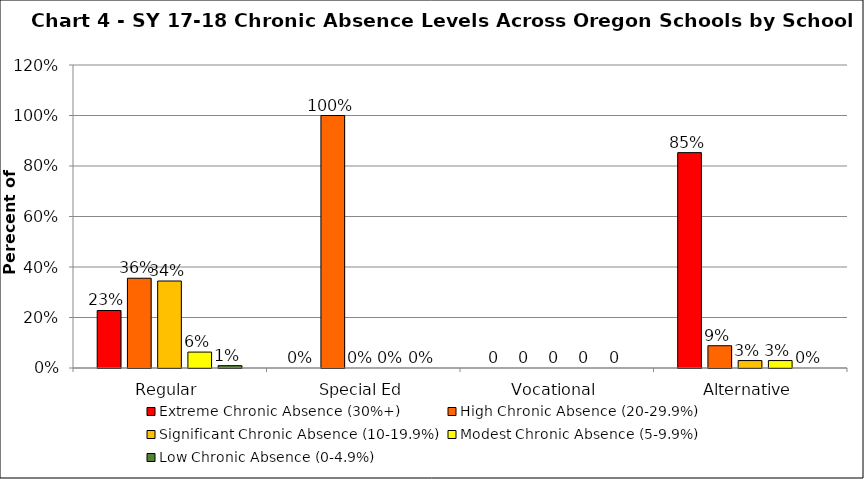
| Category | Extreme Chronic Absence (30%+) | High Chronic Absence (20-29.9%) | Significant Chronic Absence (10-19.9%) | Modest Chronic Absence (5-9.9%) | Low Chronic Absence (0-4.9%) |
|---|---|---|---|---|---|
| 0 | 0.228 | 0.355 | 0.345 | 0.063 | 0.009 |
| 1 | 0 | 1 | 0 | 0 | 0 |
| 2 | 0 | 0 | 0 | 0 | 0 |
| 3 | 0.853 | 0.088 | 0.029 | 0.029 | 0 |